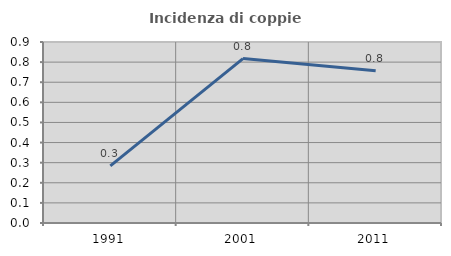
| Category | Incidenza di coppie miste |
|---|---|
| 1991.0 | 0.284 |
| 2001.0 | 0.818 |
| 2011.0 | 0.757 |